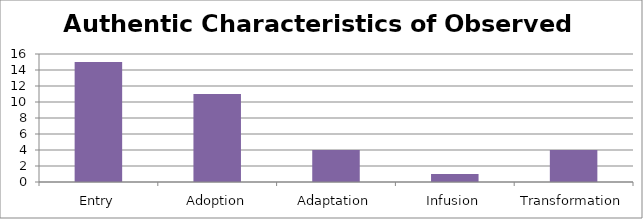
| Category | Authentic |
|---|---|
| Entry | 15 |
| Adoption | 11 |
| Adaptation | 4 |
| Infusion | 1 |
| Transformation | 4 |